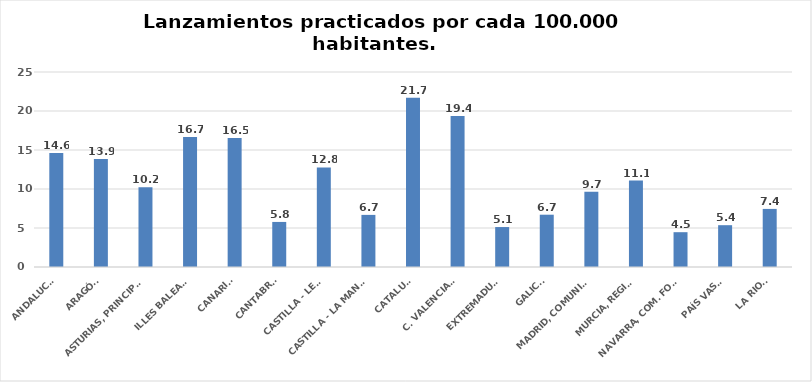
| Category | Series 0 |
|---|---|
| ANDALUCÍA | 14.625 |
| ARAGÓN | 13.859 |
| ASTURIAS, PRINCIPADO | 10.232 |
| ILLES BALEARS | 16.657 |
| CANARIAS | 16.539 |
| CANTABRIA | 5.777 |
| CASTILLA - LEÓN | 12.759 |
| CASTILLA - LA MANCHA | 6.681 |
| CATALUÑA | 21.711 |
| C. VALENCIANA | 19.355 |
| EXTREMADURA | 5.122 |
| GALICIA | 6.704 |
| MADRID, COMUNIDAD | 9.651 |
| MURCIA, REGIÓN | 11.078 |
| NAVARRA, COM. FORAL | 4.463 |
| PAÍS VASCO | 5.361 |
| LA RIOJA | 7.447 |